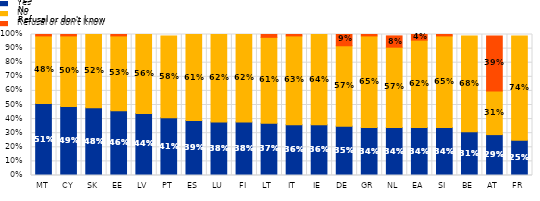
| Category | Yes | No | Refusal or don't know |
|---|---|---|---|
| MT | 0.51 | 0.48 | 0.01 |
| CY | 0.49 | 0.5 | 0.01 |
| SK | 0.48 | 0.52 | 0 |
| EE | 0.46 | 0.53 | 0.01 |
| LV | 0.44 | 0.56 | 0 |
| PT | 0.41 | 0.58 | 0 |
| ES | 0.39 | 0.61 | 0 |
| LU | 0.38 | 0.62 | 0 |
| FI | 0.38 | 0.62 | 0 |
| LT | 0.37 | 0.61 | 0.02 |
| IT | 0.36 | 0.63 | 0.01 |
| IE | 0.36 | 0.64 | 0 |
| DE | 0.35 | 0.57 | 0.09 |
| GR | 0.34 | 0.65 | 0.01 |
| NL | 0.34 | 0.57 | 0.08 |
| EA | 0.34 | 0.62 | 0.04 |
| SI | 0.34 | 0.65 | 0.01 |
| BE | 0.31 | 0.68 | 0 |
| AT | 0.29 | 0.31 | 0.39 |
| FR | 0.25 | 0.74 | 0 |